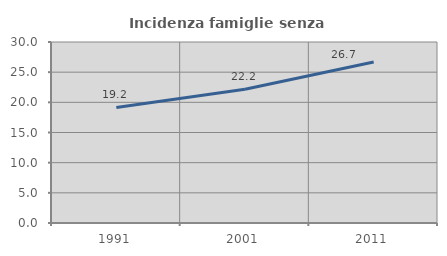
| Category | Incidenza famiglie senza nuclei |
|---|---|
| 1991.0 | 19.153 |
| 2001.0 | 22.171 |
| 2011.0 | 26.695 |